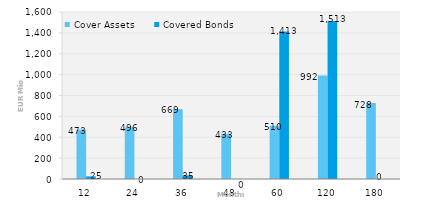
| Category | Cover Assets | Covered Bonds |
|---|---|---|
| 12.0 | 473.217 | 25 |
| 24.0 | 496.05 | 0 |
| 36.0 | 669.018 | 35 |
| 48.0 | 433.461 | 0 |
| 60.0 | 509.89 | 1413.113 |
| 120.0 | 991.506 | 1513 |
| 180.0 | 728.294 | 0 |